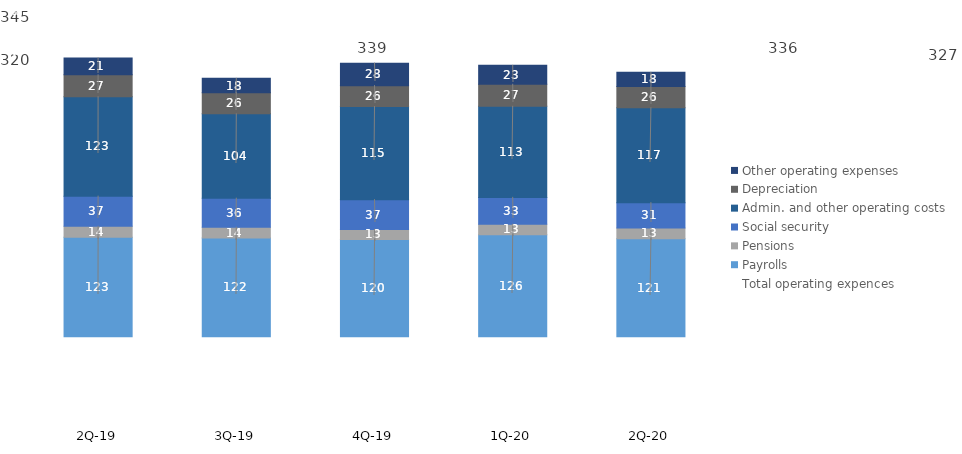
| Category | Payrolls | Pensions | Social security | Admin. and other operating costs | Depreciation | Other operating expenses |
|---|---|---|---|---|---|---|
| 2Q-20 | 121.292 | 13.37 | 31.266 | 117.403 | 26.314 | 17.514 |
| 1Q-20 | 126.236 | 12.924 | 33.263 | 112.75 | 27.262 | 23.365 |
| 4Q-19 | 120.223 | 12.54 | 36.799 | 115.196 | 25.974 | 27.802 |
| 3Q-19 | 122.031 | 13.58 | 35.843 | 104.32 | 26.181 | 17.805 |
| 2Q-19 | 123.15 | 13.54 | 37.28 | 122.97 | 27.2 | 20.83 |